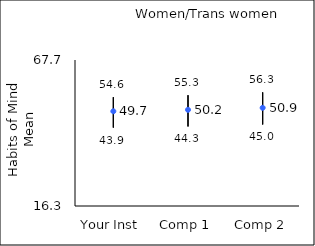
| Category | 25th percentile | 75th percentile | Mean |
|---|---|---|---|
| Your Inst | 43.9 | 54.6 | 49.65 |
| Comp 1 | 44.3 | 55.3 | 50.16 |
| Comp 2 | 45 | 56.3 | 50.87 |